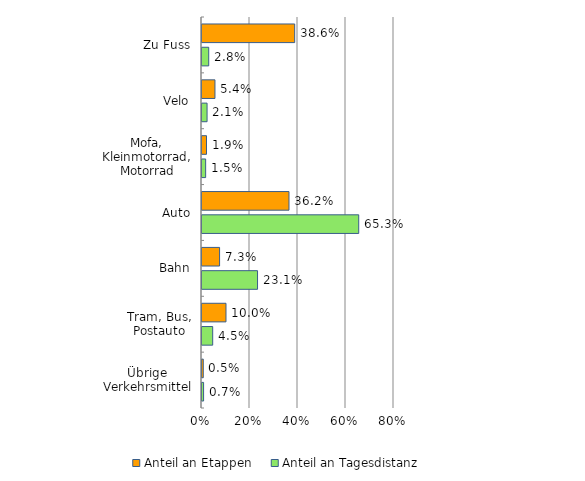
| Category | Anteil an Etappen | Anteil an Tagesdistanz |
|---|---|---|
| Zu Fuss | 38.621 | 2.804 |
| Velo | 5.401 | 2.11 |
| Mofa, Kleinmotorrad, Motorrad | 1.878 | 1.522 |
| Auto | 36.245 | 65.301 |
| Bahn | 7.328 | 23.142 |
| Tram, Bus, Postauto | 9.998 | 4.459 |
| Übrige Verkehrsmittel | 0.528 | 0.661 |